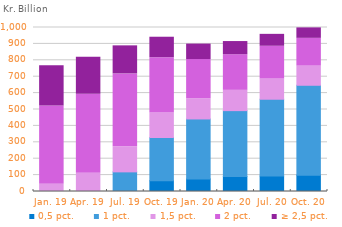
| Category | 0,5 pct. | 1 pct. | 1,5 pct. | 2 pct. | ≥ 2,5 pct. |
|---|---|---|---|---|---|
| Jan. 19 | 0 | 0 | 43.561 | 478.438 | 244.868 |
| Apr. 19 | 0 | 0.685 | 110.149 | 482.158 | 226.036 |
| Jul. 19 | 0 | 119.705 | 152.803 | 444.471 | 171.067 |
| Oct. 19 | 65.685 | 263.622 | 149.275 | 337.322 | 124.779 |
| Jan. 20 | 76.444 | 365.887 | 123.075 | 239.198 | 94.277 |
| Apr. 20 | 90.721 | 402.386 | 123.67 | 217.283 | 80.264 |
| Jul. 20 | 94.413 | 468.174 | 122.975 | 200.059 | 72.615 |
| Oct. 20 | 99.695 | 548.046 | 116.721 | 169.425 | 63.775 |